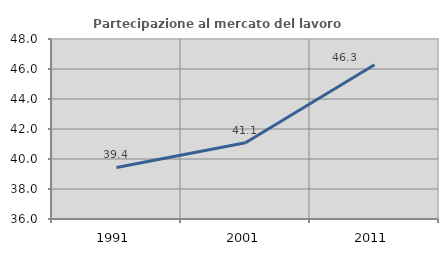
| Category | Partecipazione al mercato del lavoro  femminile |
|---|---|
| 1991.0 | 39.439 |
| 2001.0 | 41.084 |
| 2011.0 | 46.28 |